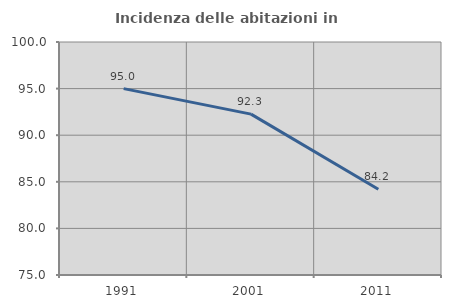
| Category | Incidenza delle abitazioni in proprietà  |
|---|---|
| 1991.0 | 94.996 |
| 2001.0 | 92.259 |
| 2011.0 | 84.193 |